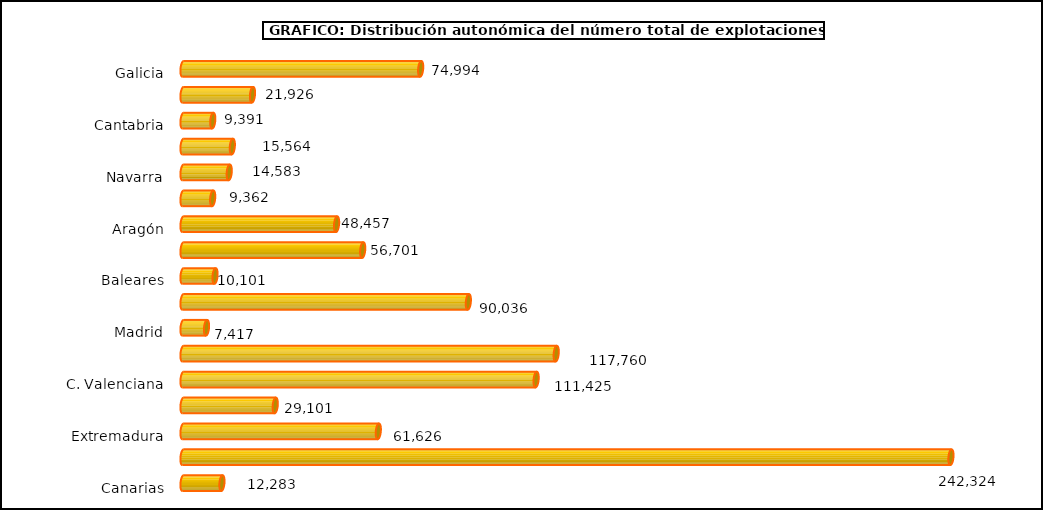
| Category | num. Explotaciones |
|---|---|
| 0 | 74994 |
| 1 | 21926 |
| 2 | 9391 |
| 3 | 15564 |
| 4 | 14583 |
| 5 | 9362 |
| 6 | 48457 |
| 7 | 56701 |
| 8 | 10101 |
| 9 | 90036 |
| 10 | 7417 |
| 11 | 117760 |
| 12 | 111425 |
| 13 | 29101 |
| 14 | 61626 |
| 15 | 242324 |
| 16 | 12283 |